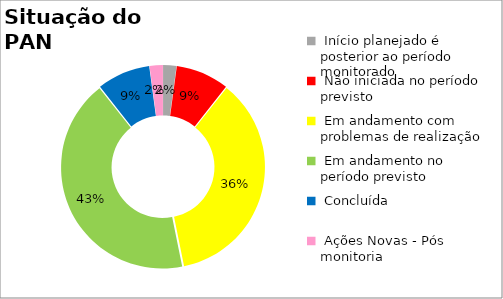
| Category | Series 0 |
|---|---|
|  Início planejado é posterior ao período monitorado | 0.021 |
|  Não iniciada no período previsto | 0.085 |
|  Em andamento com problemas de realização | 0.362 |
|  Em andamento no período previsto  | 0.426 |
|  Concluída | 0.085 |
|  Ações Novas - Pós monitoria | 0.021 |